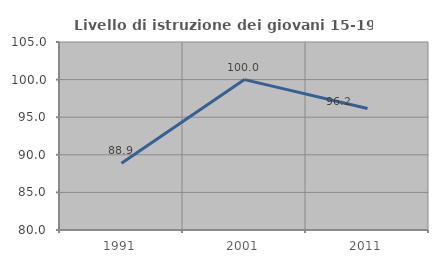
| Category | Livello di istruzione dei giovani 15-19 anni |
|---|---|
| 1991.0 | 88.889 |
| 2001.0 | 100 |
| 2011.0 | 96.154 |